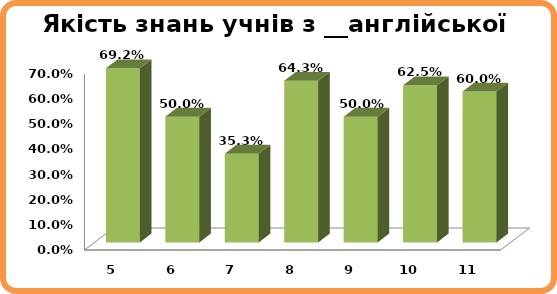
| Category | Series 0 |
|---|---|
| 5.0 | 0.692 |
| 6.0 | 0.5 |
| 7.0 | 0.353 |
| 8.0 | 0.643 |
| 9.0 | 0.5 |
| 10.0 | 0.625 |
| 11.0 | 0.6 |